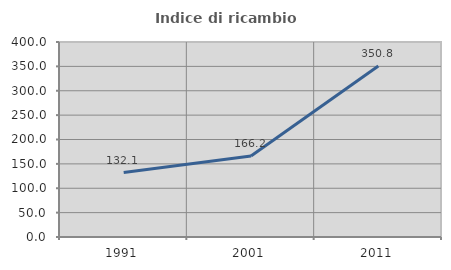
| Category | Indice di ricambio occupazionale  |
|---|---|
| 1991.0 | 132.092 |
| 2001.0 | 166.186 |
| 2011.0 | 350.812 |